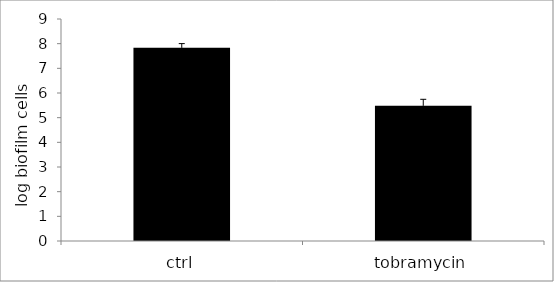
| Category | monospecies biofilm |
|---|---|
| ctrl | 7.832 |
| tobramycin | 5.484 |